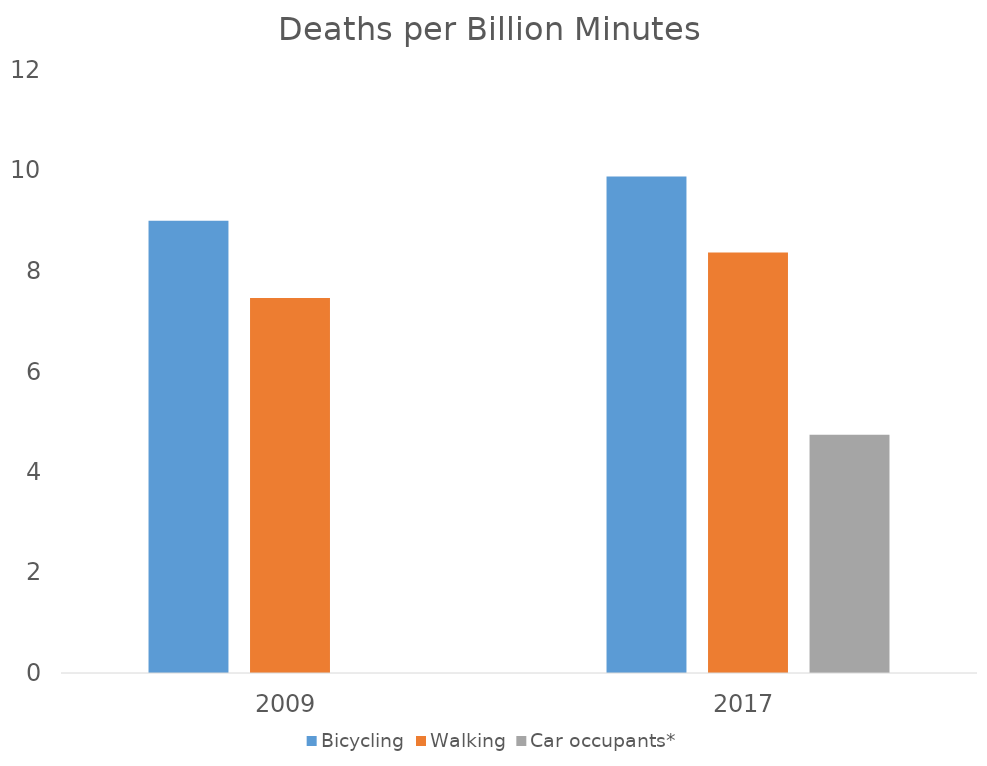
| Category | Bicycling | Walking | Car occupants* |
|---|---|---|---|
| 2009.0 | 9.001 | 7.462 | 0 |
| 2017.0 | 9.88 | 8.37 | 4.74 |